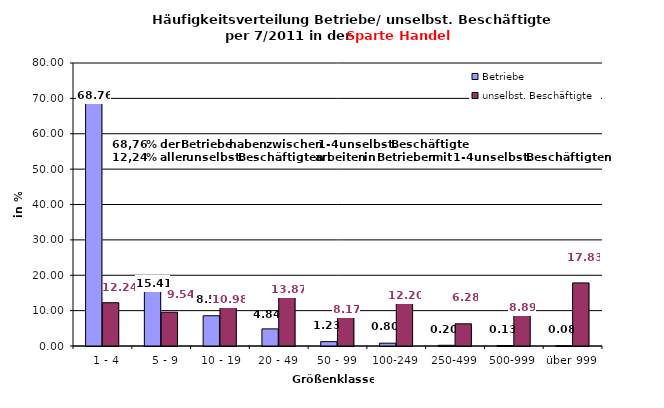
| Category | Betriebe | unselbst. Beschäftigte |
|---|---|---|
|   1 - 4 | 68.759 | 12.238 |
|   5 - 9 | 15.41 | 9.543 |
|  10 - 19 | 8.558 | 10.98 |
| 20 - 49 | 4.838 | 13.872 |
| 50 - 99 | 1.229 | 8.173 |
| 100-249 | 0.797 | 12.197 |
| 250-499 | 0.199 | 6.276 |
| 500-999 | 0.133 | 8.886 |
| über 999 | 0.077 | 17.834 |